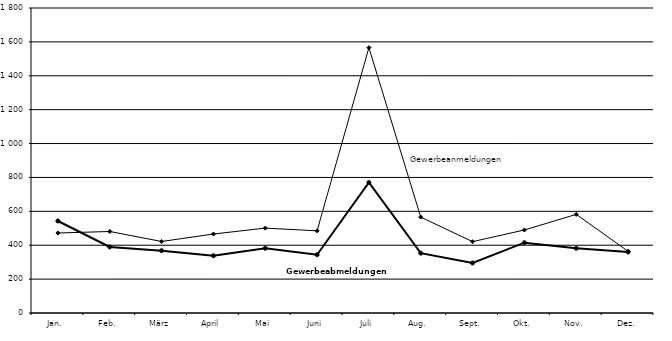
| Category | Gewerbeanmeldungen | Gewerbeabmeldungen |
|---|---|---|
| Jan. | 472 | 543 |
| Feb. | 481 | 390 |
| März | 422 | 368 |
| April | 466 | 338 |
| Mai | 501 | 382 |
| Juni | 485 | 344 |
| Juli | 1566 | 770 |
| Aug. | 566 | 353 |
| Sept. | 421 | 295 |
| Okt. | 490 | 415 |
| Nov. | 582 | 382 |
| Dez. | 364 | 360 |